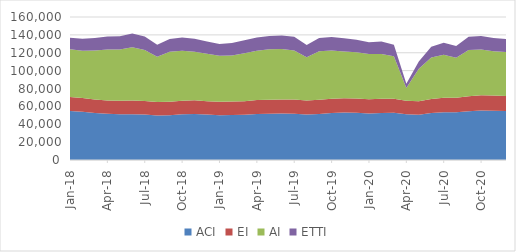
| Category | ACI | EI | AI | ETTI |
|---|---|---|---|---|
| 2018-01-01 | 54809 | 15754 | 53308 | 12946 |
| 2018-02-01 | 54022 | 15361 | 52783 | 13564 |
| 2018-03-01 | 52585 | 15012 | 54867 | 14109 |
| 2018-04-01 | 51674 | 14991 | 57104 | 14397 |
| 2018-05-01 | 51211 | 14963 | 57580 | 14732 |
| 2018-06-01 | 51269 | 15175 | 59725 | 15473 |
| 2018-07-01 | 50788 | 15202 | 57104 | 15036 |
| 2018-08-01 | 49823 | 15083 | 50638 | 13501 |
| 2018-09-01 | 50078 | 15009 | 56004 | 14389 |
| 2018-10-01 | 51066 | 15242 | 55840 | 14928 |
| 2018-11-01 | 51553 | 15220 | 54456 | 14318 |
| 2018-12-01 | 50862 | 15005 | 53060 | 13619 |
| 2019-01-01 | 50101 | 15046 | 51561 | 13190 |
| 2019-02-01 | 50281 | 15116 | 51644 | 13799 |
| 2019-03-01 | 50555 | 15219 | 53752 | 14545 |
| 2019-04-01 | 51571 | 15540 | 55082 | 14879 |
| 2019-05-01 | 51650 | 15652 | 56485 | 14933 |
| 2019-06-01 | 52062 | 15716 | 56332 | 15140 |
| 2019-07-01 | 51821 | 15858 | 54862 | 15442 |
| 2019-08-01 | 50870 | 15703 | 48485 | 13575 |
| 2019-09-01 | 51550 | 15916 | 54180 | 14905 |
| 2019-10-01 | 52523 | 16020 | 53873 | 15142 |
| 2019-11-01 | 53172 | 15937 | 52404 | 14647 |
| 2019-12-01 | 52981 | 15811 | 51851 | 13918 |
| 2020-01-01 | 52107 | 15807 | 50644 | 13195 |
| 2020-02-01 | 52684 | 15875 | 50167 | 13813 |
| 2020-03-01 | 52950 | 15646 | 47497 | 12754 |
| 2020-04-01 | 51150 | 15051 | 14342 | 4664 |
| 2020-05-01 | 50723 | 15077 | 36201 | 8202 |
| 2020-06-01 | 52463 | 15803 | 46421 | 11995 |
| 2020-07-01 | 53462 | 16214 | 48120 | 13517 |
| 2020-08-01 | 53315 | 16409 | 44768 | 12953 |
| 2020-09-01 | 54454 | 16798 | 51913 | 14744 |
| 2020-10-01 | 55378 | 16966 | 51225 | 15130 |
| 2020-11-01 | 55201 | 16987 | 49455 | 14980 |
| 2020-12-01 | 54691 | 16938 | 49170 | 14610 |